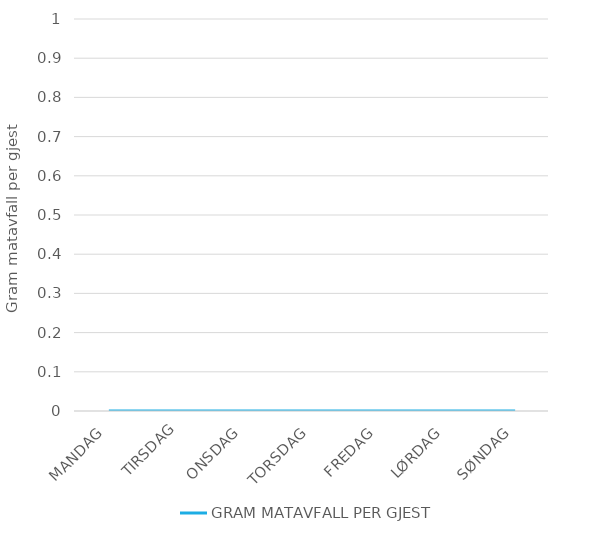
| Category |  GRAM MATAVFALL PER GJEST  |
|---|---|
| MANDAG | 0 |
| TIRSDAG | 0 |
| ONSDAG | 0 |
| TORSDAG | 0 |
| FREDAG | 0 |
| LØRDAG | 0 |
| SØNDAG | 0 |